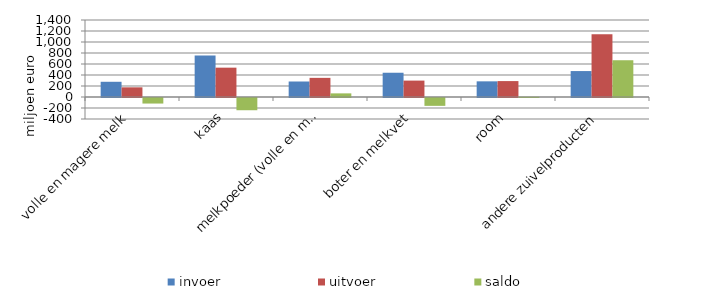
| Category | invoer | uitvoer | saldo |
|---|---|---|---|
| volle en magere melk | 276.651 | 175.719 | -100.932 |
| kaas | 755.836 | 533.354 | -222.483 |
| melkpoeder (volle en magere) | 281.918 | 347.975 | 66.057 |
| boter en melkvet | 441.07 | 298.202 | -142.868 |
| room | 284.756 | 289.439 | 4.684 |
| andere zuivelproducten | 471.614 | 1139.932 | 668.319 |